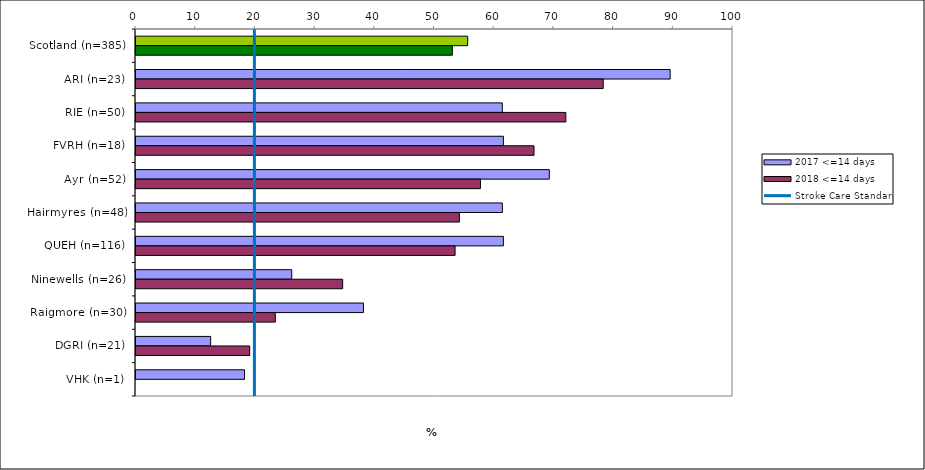
| Category | 2017 <=14 days | 2018 <=14 days |
|---|---|---|
| Scotland (n=385) | 55.556 | 52.987 |
| ARI (n=23) | 89.474 | 78.261 |
| RIE (n=50) | 61.364 | 72 |
| FVRH (n=18) | 61.538 | 66.667 |
| Ayr (n=52) | 69.231 | 57.692 |
| Hairmyres (n=48) | 61.364 | 54.167 |
| QUEH (n=116) | 61.538 | 53.448 |
| Ninewells (n=26) | 26.087 | 34.615 |
| Raigmore (n=30) | 38.095 | 23.333 |
| DGRI (n=21) | 12.5 | 19.048 |
| VHK (n=1) | 18.182 | 0 |